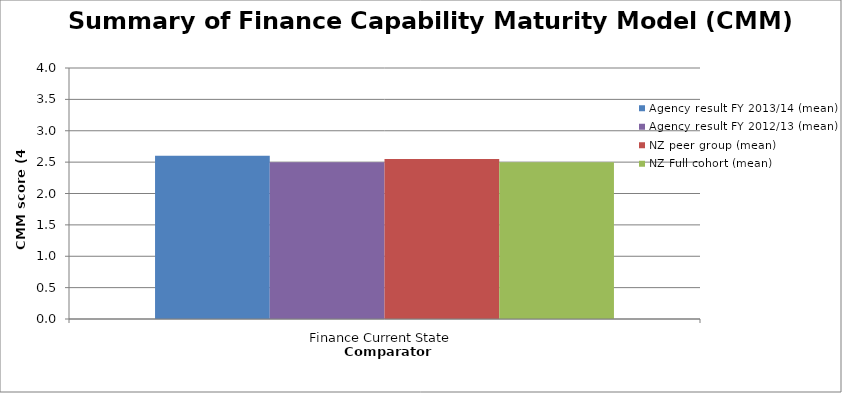
| Category | Agency result FY 2013/14 (mean) | Agency result FY 2012/13 (mean) | NZ peer group (mean) | NZ Full cohort (mean) |
|---|---|---|---|---|
| Finance Current State | 2.6 | 2.5 | 2.55 | 2.5 |